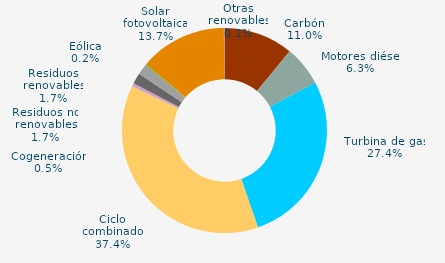
| Category | Series 0 |
|---|---|
| Carbón | 10.961 |
| Motores diésel | 6.335 |
| Turbina de gas | 27.408 |
| Ciclo combinado | 37.397 |
| Generación auxiliar | 0 |
| Cogeneración | 0.524 |
| Residuos no renovables | 1.7 |
| Residuos renovables | 1.7 |
| Eólica | 0.162 |
| Solar fotovoltaica | 13.717 |
| Otras renovables | 0.097 |